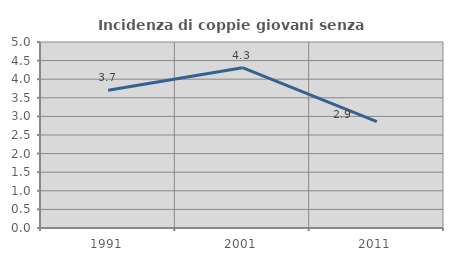
| Category | Incidenza di coppie giovani senza figli |
|---|---|
| 1991.0 | 3.704 |
| 2001.0 | 4.31 |
| 2011.0 | 2.857 |